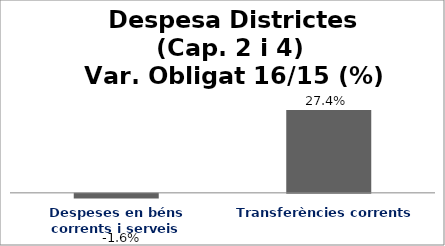
| Category | Series 0 |
|---|---|
| Despeses en béns corrents i serveis | -0.016 |
| Transferències corrents | 0.274 |